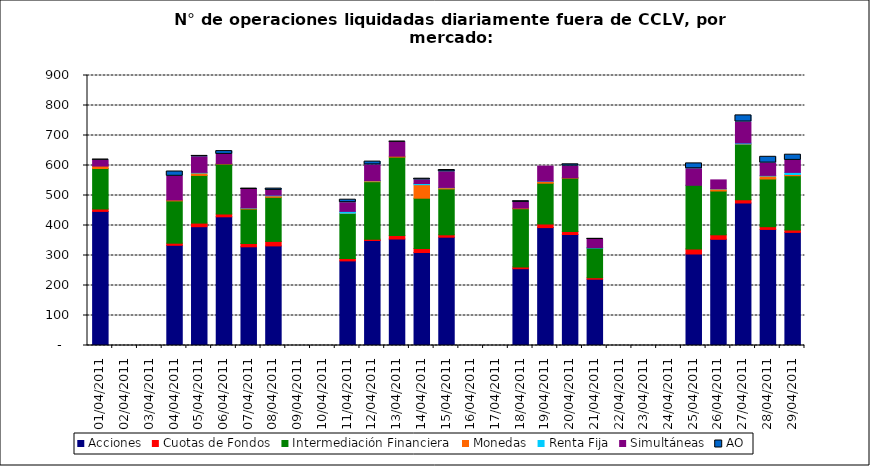
| Category | Acciones | Cuotas de Fondos | Intermediación Financiera | Monedas | Renta Fija | Simultáneas | AO |
|---|---|---|---|---|---|---|---|
| 01/04/2011 | 447 | 8 | 135 | 8 | 0 | 20 | 1 |
| 04/04/2011 | 334 | 7 | 141 | 3 | 0 | 79 | 16 |
| 05/04/2011 | 396 | 12 | 159 | 8 | 2 | 52 | 3 |
| 06/04/2011 | 429 | 9 | 167 | 1 | 0 | 31 | 11 |
| 07/04/2011 | 329 | 11 | 115 | 3 | 1 | 61 | 3 |
| 08/04/2011 | 332 | 15 | 147 | 5 | 2 | 16 | 6 |
| 11/04/2011 | 282 | 8 | 150 | 1 | 6 | 29 | 10 |
| 12/04/2011 | 350 | 4 | 192 | 3 | 1 | 52 | 11 |
| 13/04/2011 | 355 | 12 | 261 | 3 | 0 | 47 | 1 |
| 14/04/2011 | 310 | 13 | 168 | 45 | 4 | 12 | 4 |
| 15/04/2011 | 361 | 8 | 153 | 4 | 1 | 52 | 6 |
| 18/04/2011 | 256 | 6 | 194 | 2 | 0 | 19 | 4 |
| 19/04/2011 | 393 | 12 | 136 | 6 | 1 | 50 | 0 |
| 20/04/2011 | 370 | 10 | 178 | 1 | 0 | 39 | 6 |
| 21/04/2011 | 221 | 5 | 99 | 0 | 1 | 28 | 1 |
| 25/04/2011 | 305 | 17 | 212 | 0 | 0 | 55 | 18 |
| 26/04/2011 | 354 | 15 | 146 | 7 | 1 | 29 | 0 |
| 27/04/2011 | 475 | 11 | 185 | 1 | 3 | 70 | 22 |
| 28/04/2011 | 387 | 9 | 159 | 10 | 2 | 41 | 21 |
| 29/04/2011 | 377 | 8 | 181 | 4 | 7 | 40 | 19 |